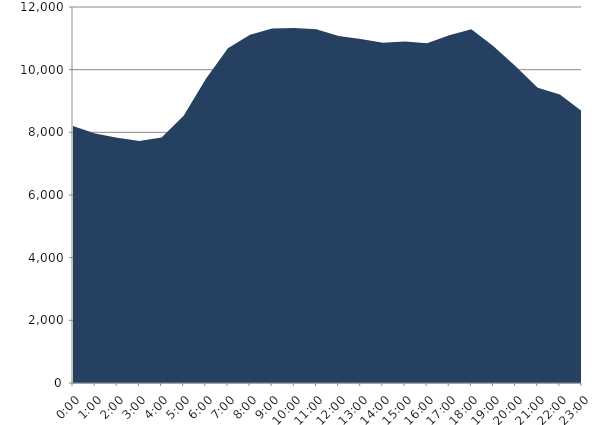
| Category | Series 0 | Series 1 |
|---|---|---|
| 2018-02-21 |  | 8203.55 |
| 2018-02-21 01:00:00 |  | 7961.06 |
| 2018-02-21 02:00:00 |  | 7829.41 |
| 2018-02-21 03:00:00 |  | 7726.25 |
| 2018-02-21 04:00:00 |  | 7839.01 |
| 2018-02-21 05:00:00 |  | 8532.2 |
| 2018-02-21 06:00:00 |  | 9705.54 |
| 2018-02-21 07:00:00 |  | 10681.58 |
| 2018-02-21 08:00:00 |  | 11115.89 |
| 2018-02-21 09:00:00 |  | 11312.57 |
| 2018-02-21 10:00:00 |  | 11331.13 |
| 2018-02-21 11:00:00 |  | 11291.93 |
| 2018-02-21 12:00:00 |  | 11070.68 |
| 2018-02-21 13:00:00 |  | 10979.1 |
| 2018-02-21 14:00:00 |  | 10860.11 |
| 2018-02-21 15:00:00 |  | 10897.42 |
| 2018-02-21 16:00:00 |  | 10844.06 |
| 2018-02-21 17:00:00 |  | 11099.52 |
| 2018-02-21 18:00:00 |  | 11286.01 |
| 2018-02-21 19:00:00 |  | 10750.34 |
| 2018-02-21 20:00:00 |  | 10107.51 |
| 2018-02-21 21:00:00 |  | 9426.14 |
| 2018-02-21 22:00:00 |  | 9205.18 |
| 2018-02-21 23:00:00 |  | 8669.79 |